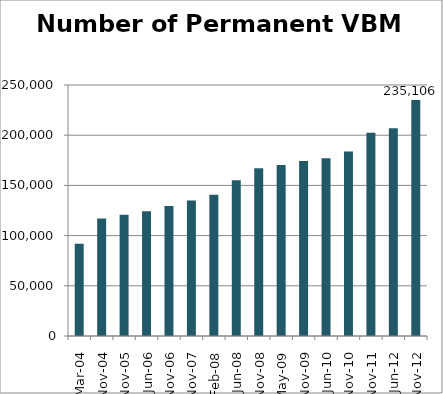
| Category | Number of Permanent VBM Voters |
|---|---|
| Mar-04 | 91889 |
| Nov-04 | 117132 |
| Nov-05 | 120813 |
| Jun-06 | 124323 |
| Nov-06 | 129523 |
| Nov-07 | 134997 |
| Feb-08 | 140579 |
| Jun-08 | 155245 |
| Nov-08 | 167148 |
| May-09 | 170282 |
| Nov-09 | 174383 |
| Jun-10 | 176983 |
| Nov-10 | 183733 |
| Nov-11 | 202388 |
| Jun-12 | 206921 |
| Nov-12 | 235106 |